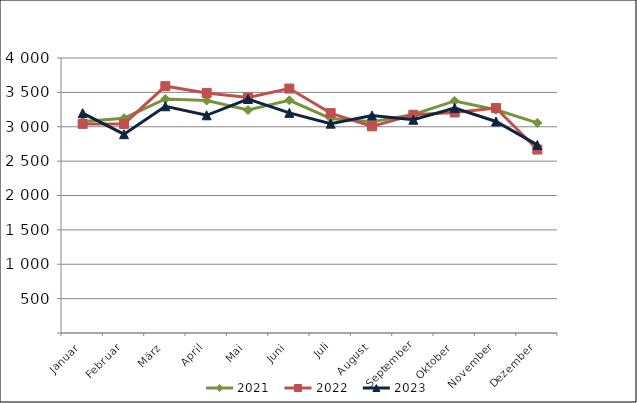
| Category | 2021 | 2022 | 2023 |
|---|---|---|---|
| Januar | 3075.869 | 3041.601 | 3198.632 |
| Februar | 3124.63 | 3040.984 | 2891.842 |
| März | 3403.806 | 3589.989 | 3297.74 |
| April | 3380.786 | 3492.475 | 3166.88 |
| Mai | 3243.564 | 3425.761 | 3403.692 |
| Juni | 3385.115 | 3555.617 | 3201.87 |
| Juli | 3121.39 | 3198.382 | 3045.334 |
| August | 3071.147 | 3006.05 | 3164.578 |
| September | 3178.618 | 3174.276 | 3102.225 |
| Oktober | 3375.594 | 3207.801 | 3271.951 |
| November | 3247.026 | 3273.381 | 3076.861 |
| Dezember | 3055.864 | 2668.321 | 2735.587 |